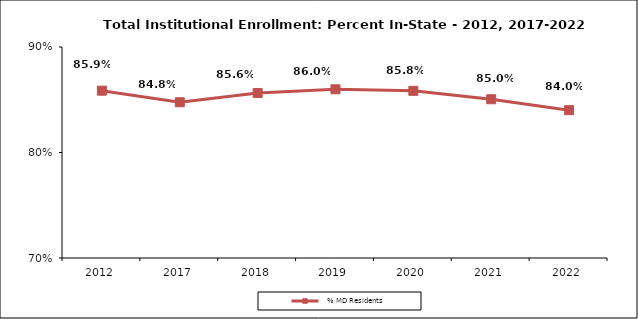
| Category |   % MD Residents |
|---|---|
| 2012.0 | 0.859 |
| 2017.0 | 0.848 |
| 2018.0 | 0.856 |
| 2019.0 | 0.86 |
| 2020.0 | 0.858 |
| 2021.0 | 0.85 |
| 2022.0 | 0.84 |